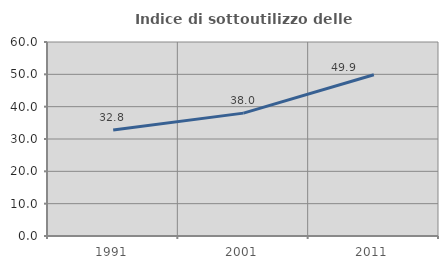
| Category | Indice di sottoutilizzo delle abitazioni  |
|---|---|
| 1991.0 | 32.809 |
| 2001.0 | 38.004 |
| 2011.0 | 49.883 |